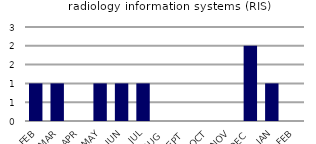
| Category | radiology information systems (RIS) |
|---|---|
| FEB | 1 |
| MAR | 1 |
| APR | 0 |
| MAY | 1 |
| JUN | 1 |
| JUL | 1 |
| AUG | 0 |
| SEPT | 0 |
| OCT | 0 |
| NOV | 0 |
| DEC | 2 |
| JAN | 1 |
| FEB | 0 |